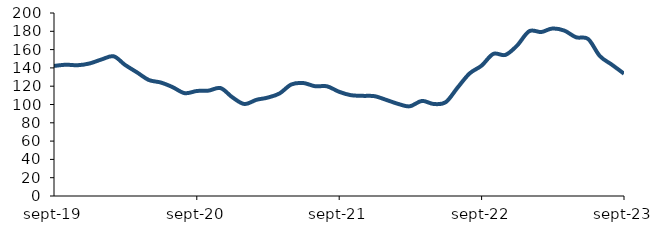
| Category | Series 0 |
|---|---|
| 2019-09-01 | 142.134 |
| 2019-10-01 | 143.438 |
| 2019-11-01 | 142.938 |
| 2019-12-01 | 144.831 |
| 2020-01-01 | 149.242 |
| 2020-02-01 | 152.669 |
| 2020-03-01 | 143.292 |
| 2020-04-01 | 135.035 |
| 2020-05-01 | 126.788 |
| 2020-06-01 | 124.002 |
| 2020-07-01 | 118.983 |
| 2020-08-01 | 112.386 |
| 2020-09-01 | 114.763 |
| 2020-10-01 | 115.159 |
| 2020-11-01 | 117.935 |
| 2020-12-01 | 107.927 |
| 2021-01-01 | 100.528 |
| 2021-02-01 | 105.144 |
| 2021-03-01 | 107.453 |
| 2021-04-01 | 112.047 |
| 2021-05-01 | 121.818 |
| 2021-06-01 | 123.47 |
| 2021-07-01 | 119.987 |
| 2021-08-01 | 119.848 |
| 2021-09-01 | 113.862 |
| 2021-10-01 | 110.18 |
| 2021-11-01 | 109.442 |
| 2021-12-01 | 109.08 |
| 2022-01-01 | 104.823 |
| 2022-02-01 | 100.399 |
| 2022-03-01 | 98.015 |
| 2022-04-01 | 103.921 |
| 2022-05-01 | 100.574 |
| 2022-06-01 | 102.532 |
| 2022-07-01 | 118.21 |
| 2022-08-01 | 133.857 |
| 2022-09-01 | 142.486 |
| 2022-10-01 | 155.309 |
| 2022-11-01 | 154.196 |
| 2022-12-01 | 164.427 |
| 2023-01-01 | 180.099 |
| 2023-02-01 | 179.207 |
| 2023-03-01 | 183.024 |
| 2023-04-01 | 180.783 |
| 2023-05-01 | 173.471 |
| 2023-06-01 | 171.62 |
| 2023-07-01 | 153.01 |
| 2023-08-01 | 143.477 |
| 2023-09-01 | 133.7 |